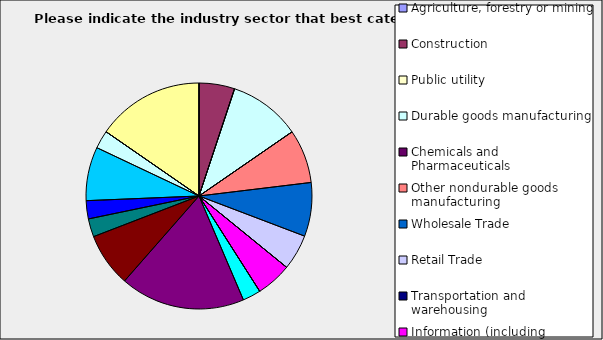
| Category | Series 0 |
|---|---|
| Agriculture, forestry or mining | 0 |
| Construction | 0.051 |
| Public utility | 0 |
| Durable goods manufacturing | 0.103 |
| Chemicals and Pharmaceuticals | 0 |
| Other nondurable goods manufacturing | 0.077 |
| Wholesale Trade | 0.077 |
| Retail Trade | 0.051 |
| Transportation and warehousing | 0 |
| Information (including broadcasting and telecommunication) | 0.051 |
| Finance and Insurance | 0 |
| Real Estate | 0.026 |
| Professional, scientific and technical services | 0.179 |
| Consulting | 0.077 |
| Administrative and office services (including waste management) | 0.026 |
| Education | 0.026 |
| Health Care and social services | 0.077 |
| Arts, entertainment and recreation | 0.026 |
| Accommodation and food services | 0 |
| Other | 0.154 |